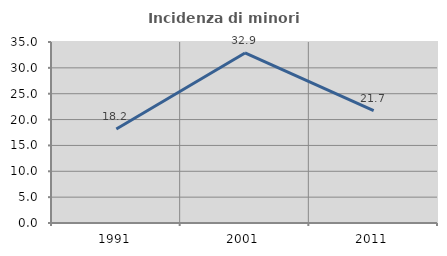
| Category | Incidenza di minori stranieri |
|---|---|
| 1991.0 | 18.182 |
| 2001.0 | 32.877 |
| 2011.0 | 21.739 |